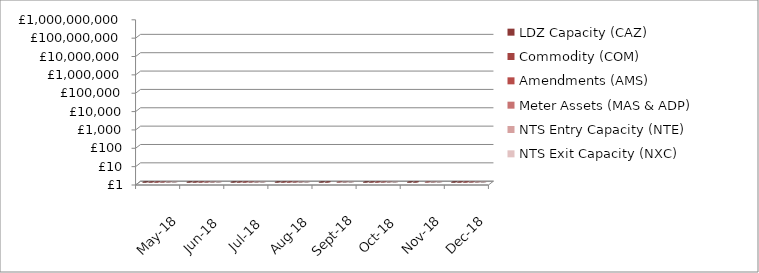
| Category | LDZ Capacity (CAZ) | Commodity (COM) | Amendments (AMS) | Meter Assets (MAS & ADP) | NTS Entry Capacity (NTE) | NTS Exit Capacity (NXC) |
|---|---|---|---|---|---|---|
| 2018-05-01 | 312174512.16 | 19449237 | 2024085.07 | 200707.08 | 1599795.55 | 18702620.75 |
| 2018-06-01 | 302299412.99 | 14591606.04 | 2213969.29 | 194233.54 | 1621553.61 | 18117525.2 |
| 2018-07-01 | 312562745.62 | 14290600.7 | 1483244.96 | 200707.69 | 1735803.71 | 18720256.49 |
| 2018-08-01 | 312780813.69 | 15048321.28 | 830443.17 | 200263.88 | 1735803.71 | 18720256.49 |
| 2018-09-01 | 302866760.19 | 17528307.3 | -385853.99 | 189788.22 | 1760935.51 | 18113875.74 |
| 2018-10-01 | 313359948.83 | 29476349.27 | 58182.64 | 196114.17 | 8332609.71 | 13807265.85 |
| 2018-11-01 | 303715362.33 | 37862420.69 | -765656.96 | 189786.88 | 8064487.69 | 13789980.96 |
| 2018-12-01 | 309858247 | 42951905.58 | 374357.97 | 196114.66 | 8796213.72 | 13770471.59 |